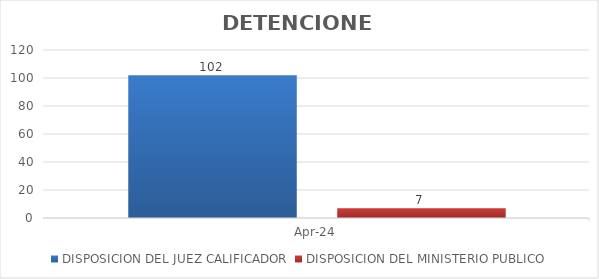
| Category | DISPOSICION DEL JUEZ CALIFICADOR | DISPOSICION DEL MINISTERIO PUBLICO |
|---|---|---|
| 2024-04-01 | 102 | 7 |